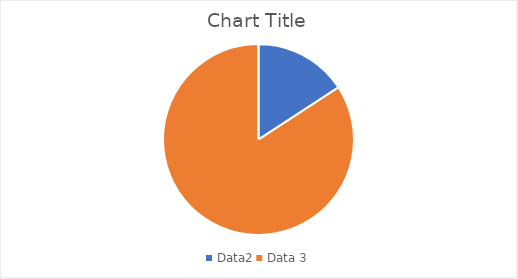
| Category | Series 0 |
|---|---|
| Data2 | 66.667 |
| Data 3 | 33.333 |